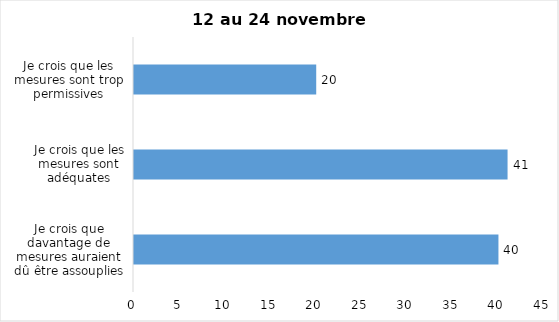
| Category | Series 0 |
|---|---|
| Je crois que davantage de mesures auraient dû être assouplies | 40 |
| Je crois que les mesures sont adéquates | 41 |
| Je crois que les mesures sont trop permissives | 20 |